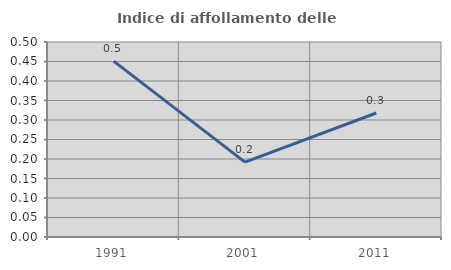
| Category | Indice di affollamento delle abitazioni  |
|---|---|
| 1991.0 | 0.451 |
| 2001.0 | 0.192 |
| 2011.0 | 0.318 |